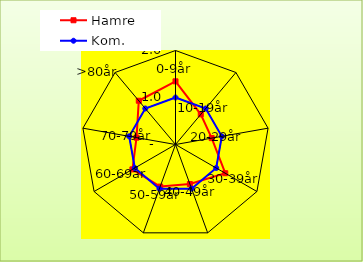
| Category | Hamre | Kom. |
|---|---|---|
| 0-9år | 1.344 | 1 |
| 10-19år | 0.837 | 1 |
| 20-29år | 0.782 | 1 |
| 30-39år | 1.222 | 1 |
| 40-49år | 0.895 | 1 |
| 50-59år | 0.953 | 1 |
| 60-69år | 1.059 | 1 |
| 70-79år | 0.842 | 1 |
| >80år | 1.215 | 1 |